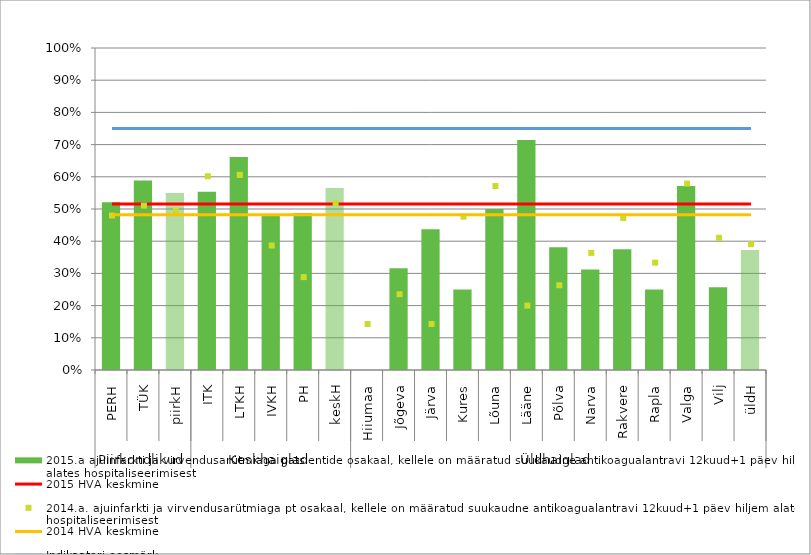
| Category | 2015.a ajuinfarkti ja virvendusarütmiaga patsientide osakaal, kellele on määratud suukaudne antikoagualantravi 12kuud+1 päev hiljem alates hospitaliseerimisest |
|---|---|
| 0 | 0.521 |
| 1 | 0.588 |
| 2 | 0.55 |
| 3 | 0.554 |
| 4 | 0.661 |
| 5 | 0.484 |
| 6 | 0.488 |
| 7 | 0.565 |
| 8 | 0 |
| 9 | 0.316 |
| 10 | 0.438 |
| 11 | 0.25 |
| 12 | 0.5 |
| 13 | 0.714 |
| 14 | 0.381 |
| 15 | 0.312 |
| 16 | 0.375 |
| 17 | 0.25 |
| 18 | 0.571 |
| 19 | 0.257 |
| 20 | 0.372 |